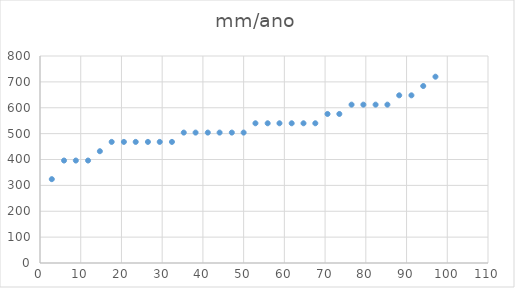
| Category | Series 0 |
|---|---|
| 2.9 | 324 |
| 5.9 | 396 |
| 8.8 | 396 |
| 11.8 | 396 |
| 14.7 | 432 |
| 17.6 | 468 |
| 20.6 | 468 |
| 23.5 | 468 |
| 26.5 | 468 |
| 29.4 | 468 |
| 32.4 | 468 |
| 35.3 | 504 |
| 38.2 | 504 |
| 41.2 | 504 |
| 44.1 | 504 |
| 47.1 | 504 |
| 50.0 | 504 |
| 52.9 | 540 |
| 55.9 | 540 |
| 58.8 | 540 |
| 61.8 | 540 |
| 64.7 | 540 |
| 67.6 | 540 |
| 70.6 | 576 |
| 73.5 | 576 |
| 76.5 | 612 |
| 79.4 | 612 |
| 82.4 | 612 |
| 85.3 | 612 |
| 88.2 | 648 |
| 91.2 | 648 |
| 94.1 | 684 |
| 97.1 | 720 |